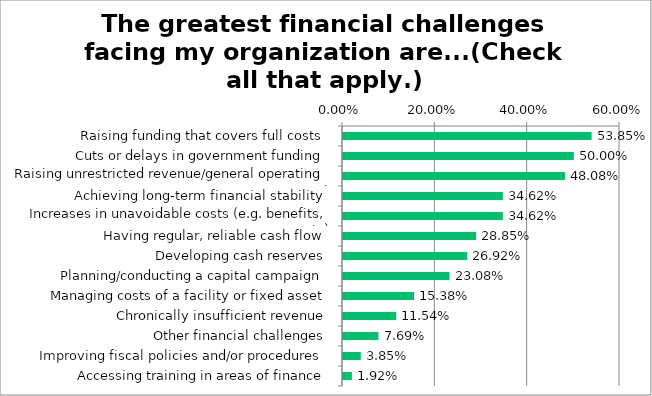
| Category | Responses |
|---|---|
| Raising funding that covers full costs | 0.538 |
| Cuts or delays in government funding | 0.5 |
| Raising unrestricted revenue/general operating support | 0.481 |
| Achieving long-term financial stability | 0.346 |
| Increases in unavoidable costs (e.g. benefits, rents) | 0.346 |
| Having regular, reliable cash flow | 0.288 |
| Developing cash reserves | 0.269 |
| Planning/conducting a capital campaign | 0.231 |
| Managing costs of a facility or fixed asset | 0.154 |
| Chronically insufficient revenue | 0.115 |
| Other financial challenges | 0.077 |
| Improving fiscal policies and/or procedures | 0.038 |
| Accessing training in areas of finance | 0.019 |